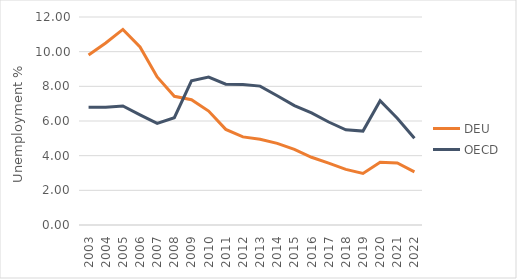
| Category | DEU | OECD |
|---|---|---|
| 2003.0 | 9.808 | 6.8 |
| 2004.0 | 10.5 | 6.797 |
| 2005.0 | 11.283 | 6.863 |
| 2006.0 | 10.275 | 6.353 |
| 2007.0 | 8.542 | 5.858 |
| 2008.0 | 7.425 | 6.188 |
| 2009.0 | 7.225 | 8.313 |
| 2010.0 | 6.575 | 8.535 |
| 2011.0 | 5.517 | 8.127 |
| 2012.0 | 5.083 | 8.108 |
| 2013.0 | 4.95 | 8.014 |
| 2014.0 | 4.708 | 7.455 |
| 2015.0 | 4.367 | 6.888 |
| 2016.0 | 3.908 | 6.47 |
| 2017.0 | 3.567 | 5.941 |
| 2018.0 | 3.208 | 5.491 |
| 2019.0 | 2.975 | 5.418 |
| 2020.0 | 3.625 | 7.164 |
| 2021.0 | 3.575 | 6.164 |
| 2022.0 | 3.067 | 5.003 |